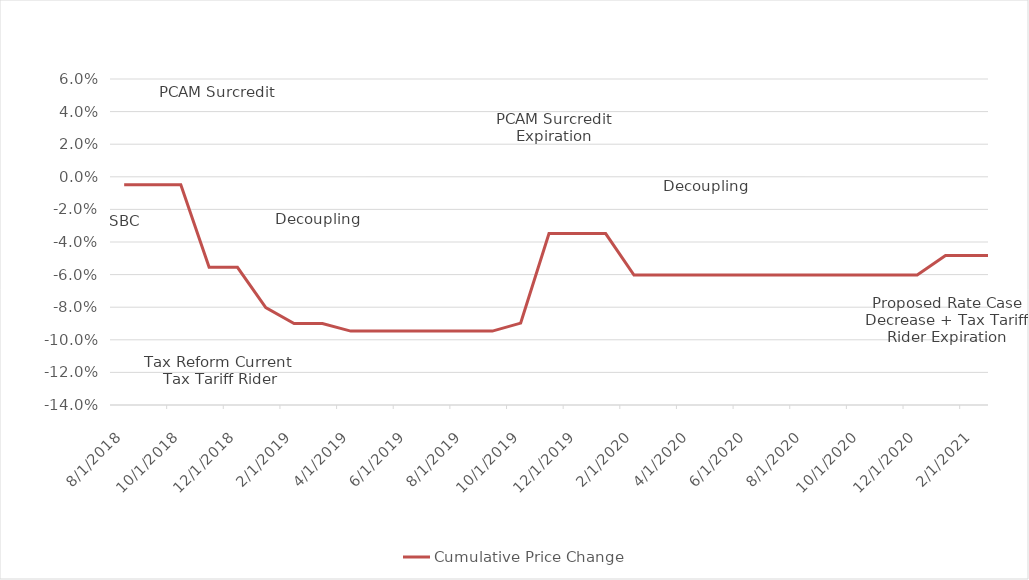
| Category | Cumulative Price Change |
|---|---|
| 8/1/18 | -0.005 |
| 9/1/18 | -0.005 |
| 10/1/18 | -0.005 |
| 11/1/18 | -0.056 |
| 12/1/18 | -0.056 |
| 1/1/19 | -0.08 |
| 2/1/19 | -0.09 |
| 3/1/19 | -0.09 |
| 4/1/19 | -0.095 |
| 5/1/19 | -0.095 |
| 6/1/19 | -0.095 |
| 7/1/19 | -0.095 |
| 8/1/19 | -0.095 |
| 9/1/19 | -0.095 |
| 10/1/19 | -0.09 |
| 11/1/19 | -0.035 |
| 12/1/19 | -0.035 |
| 1/1/20 | -0.035 |
| 2/1/20 | -0.06 |
| 3/1/20 | -0.06 |
| 4/1/20 | -0.06 |
| 5/1/20 | -0.06 |
| 6/1/20 | -0.06 |
| 7/1/20 | -0.06 |
| 8/1/20 | -0.06 |
| 9/1/20 | -0.06 |
| 10/1/20 | -0.06 |
| 11/1/20 | -0.06 |
| 12/1/20 | -0.06 |
| 1/1/21 | -0.048 |
| 2/1/21 | -0.048 |
| 3/1/21 | -0.048 |
| 4/1/21 | -0.048 |
| 5/1/21 | -0.048 |
| 6/1/21 | -0.048 |
| 7/1/21 | -0.048 |
| 8/1/21 | -0.048 |
| 9/1/21 | -0.048 |
| 10/1/21 | -0.048 |
| 11/1/21 | -0.048 |
| 12/1/21 | -0.048 |